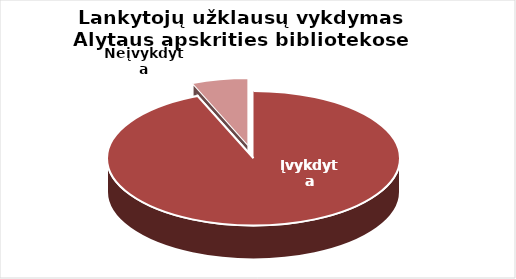
| Category | Series 0 |
|---|---|
| Įvykdyta | 32242 |
| Neįvykdyta | 2138 |